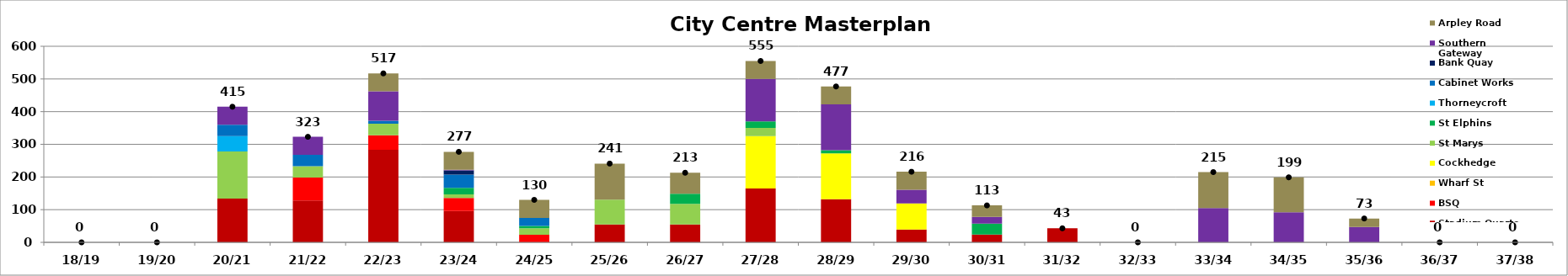
| Category | Stadium Quarter | BSQ | Wharf St | Cockhedge | St Marys | St Elphins | Thorneycroft | Cabinet Works | Bank Quay | Southern Gateway | Arpley Road |
|---|---|---|---|---|---|---|---|---|---|---|---|
| 18/19 | 0 | 0 | 0 | 0 | 0 | 0 | 0 | 0 | 0 | 0 | 0 |
| 19/20 | 0 | 0 | 0 | 0 | 0 | 0 | 0 | 0 | 0 | 0 | 0 |
| 20/21 | 134 | 0 | 0 | 0 | 144 | 0 | 47 | 35 | 0 | 55 | 0 |
| 21/22 | 128 | 70 | 0 | 0 | 35 | 0 | 0 | 35 | 0 | 55 | 0 |
| 22/23 | 283 | 45 | 0 | 0 | 35 | 0 | 0 | 9 | 0 | 90 | 55 |
| 23/24 | 96 | 40 | 0 | 0 | 11 | 20 | 0 | 40 | 13 | 2 | 55 |
| 24/25 | 0 | 23 | 0 | 0 | 20 | 7 | 0 | 25 | 0 | 0 | 55 |
| 25/26 | 55 | 0 | 0 | 0 | 76 | 0 | 0 | 0 | 0 | 0 | 110 |
| 26/27 | 55 | 0 | 0 | 0 | 63 | 31 | 0 | 0 | 0 | 0 | 64 |
| 27/28 | 165 | 0 | 0 | 160 | 25 | 20 | 0 | 0 | 0 | 130 | 55 |
| 28/29 | 132 | 0 | 0 | 140 | 0 | 10 | 0 | 0 | 0 | 140 | 55 |
| 29/30 | 39 | 0 | 0 | 80 | 0 | 0 | 0 | 0 | 0 | 42 | 55 |
| 30/31 | 24 | 0 | 0 | 0 | 0 | 33 | 0 | 0 | 0 | 21 | 35 |
| 31/32 | 43 | 0 | 0 | 0 | 0 | 0 | 0 | 0 | 0 | 0 | 0 |
| 32/33 | 0 | 0 | 0 | 0 | 0 | 0 | 0 | 0 | 0 | 0 | 0 |
| 33/34 | 0 | 0 | 0 | 0 | 0 | 0 | 0 | 0 | 0 | 105 | 110 |
| 34/35 | 0 | 0 | 0 | 0 | 0 | 0 | 0 | 0 | 0 | 92 | 107 |
| 35/36 | 0 | 0 | 0 | 0 | 0 | 0 | 0 | 0 | 0 | 47 | 26 |
| 36/37 | 0 | 0 | 0 | 0 | 0 | 0 | 0 | 0 | 0 | 0 | 0 |
| 37/38 | 0 | 0 | 0 | 0 | 0 | 0 | 0 | 0 | 0 | 0 | 0 |